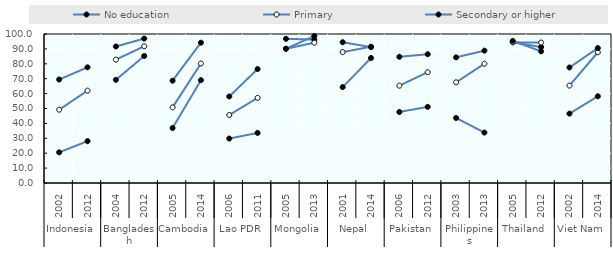
| Category | No education | Primary | Secondary or higher |
|---|---|---|---|
| 0 | 20.58 | 49.197 | 69.46 |
| 1 | 28.082 | 61.991 | 77.641 |
| 2 | 69.249 | 82.799 | 91.63 |
| 3 | 85.236 | 91.751 | 96.929 |
| 4 | 36.916 | 50.761 | 68.669 |
| 5 | 69.026 | 80.217 | 94.18 |
| 6 | 29.826 | 45.649 | 58.069 |
| 7 | 33.617 | 57.128 | 76.469 |
| 8 | 96.761 | 90.091 | 90.093 |
| 9 | 96.283 | 94.164 | 98.648 |
| 10 | 64.35 | 87.837 | 94.479 |
| 11 | 83.9 | 91.5 | 91.2 |
| 12 | 47.676 | 65.322 | 84.705 |
| 13 | 51.104 | 74.394 | 86.42 |
| 14 | 43.637 | 67.57 | 84.338 |
| 15 | 33.846 | 80.05 | 88.825 |
| 16 | 94.475 | 94.414 | 95.369 |
| 17 | 91.243 | 94.282 | 88.374 |
| 18 | 46.558 | 65.394 | 77.52 |
| 19 | 58.2 | 87.763 | 90.56 |